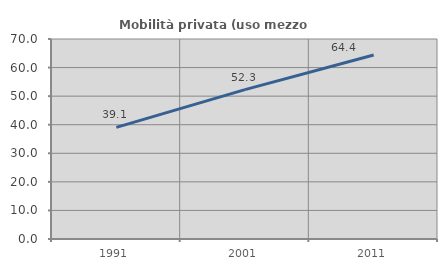
| Category | Mobilità privata (uso mezzo privato) |
|---|---|
| 1991.0 | 39.07 |
| 2001.0 | 52.281 |
| 2011.0 | 64.419 |